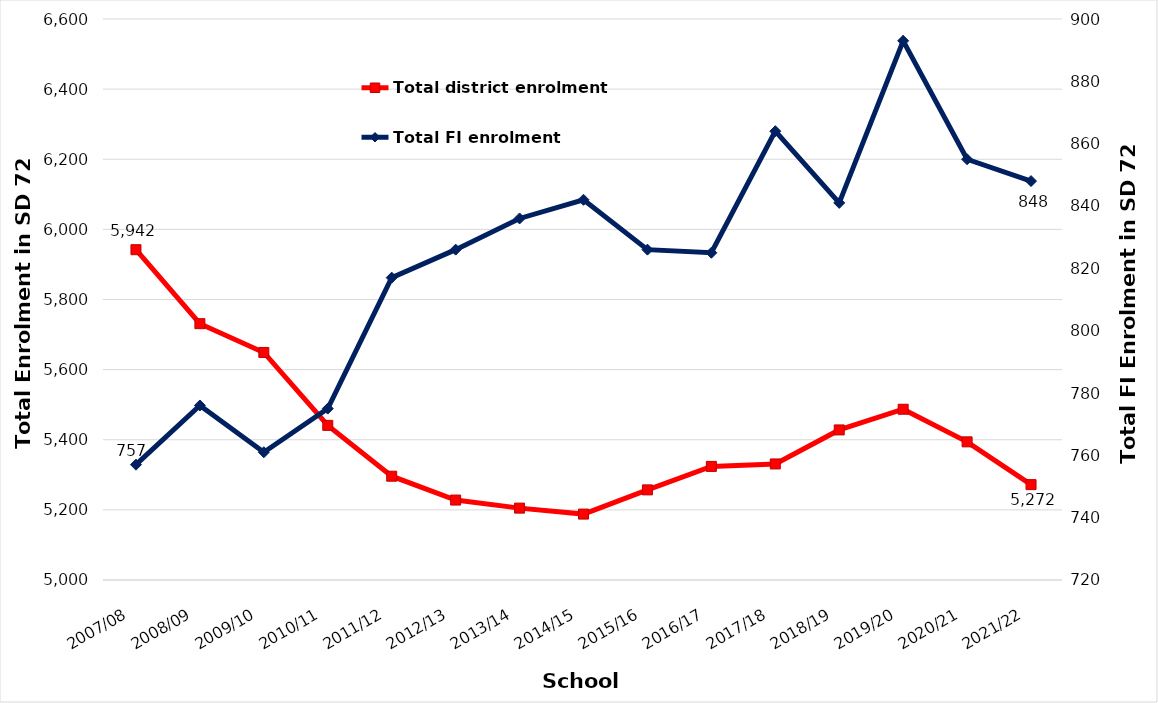
| Category | Total district enrolment  |
|---|---|
| 2007/08 | 5942 |
| 2008/09 | 5731 |
| 2009/10 | 5649 |
| 2010/11 | 5441 |
| 2011/12 | 5296 |
| 2012/13 | 5228 |
| 2013/14 | 5205 |
| 2014/15 | 5188 |
| 2015/16 | 5257 |
| 2016/17 | 5324 |
| 2017/18 | 5331 |
| 2018/19 | 5428 |
| 2019/20 | 5487 |
| 2020/21 | 5394 |
| 2021/22 | 5272 |